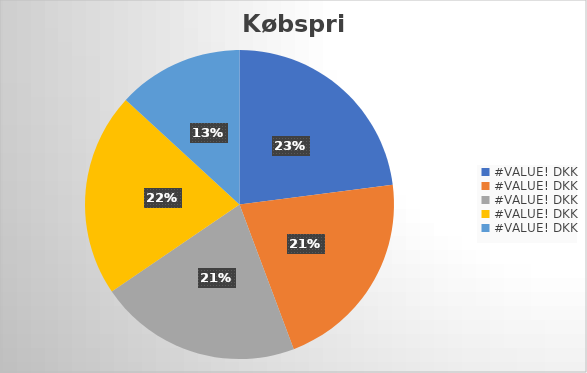
| Category | Series 2 |
|---|---|
| 0 | 25920 |
| 1 | 24080 |
| 2 | 23940 |
| 3 | 24100 |
| 4 | 14860 |